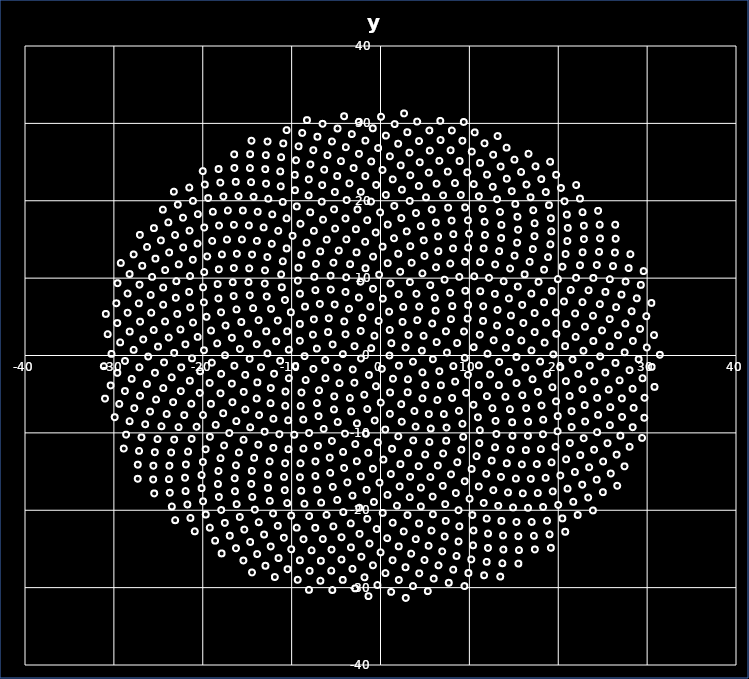
| Category | y |
|---|---|
| 1.0 | 0 |
| -1.0427970936428017 | 0.955 |
| 0.1514258902703649 | -1.725 |
| 1.2168775933951685 | 1.587 |
| -2.201886249462149 | -0.389 |
| 2.0667701175467137 | -1.315 |
| -0.6868488439654367 | 2.555 |
| -1.3036414562824385 | -2.51 |
| 2.8179636666845864 | 1.029 |
| -2.9230375956493755 | 1.207 |
| 1.4057389455386489 | -3.004 |
| 1.0367487365334913 | 3.305 |
| -3.1195627951311913 | -1.808 |
| 3.6543864048728047 | -0.803 |
| -2.22746789859802 | 3.168 |
| -0.5140411526383476 | -3.967 |
| 3.152727426917154 | 2.657 |
| -4.239017781566231 | 0.175 |
| 3.089717279442825 | -3.075 |
| -0.20657671794645202 | 4.467 |
| -2.936096255307038 | -3.518 |
| 4.64852723793221 | 0.625 |
| -3.9366999155815305 | 2.739 |
| 1.0752376934697032 | -4.78 |
| 2.48590156366684 | 4.338 |
| -4.857798015295011 | -1.55 |
| 4.7170226280028915 | -2.179 |
| -2.042846787210307 | 4.881 |
| -1.8226174734269953 | -5.067 |
| 4.848380230100924 | 2.548 |
| -5.383862284478178 | 1.419 |
| 3.059444241048141 | -4.758 |
| 0.9729871422187473 | 5.662 |
| -4.610082518912712 | -3.57 |
| 5.895880809300576 | -0.488 |
| -4.074480240837586 | 4.404 |
| 0.029679313881297995 | -6.083 |
| 4.1417737703254085 | 4.566 |
| -6.21834813116179 | -0.576 |
| 5.03788828144644 | -3.824 |
| -1.1460609228401943 | 6.3 |
| -3.451672677211961 | -5.485 |
| 6.324235433015204 | 1.733 |
| -5.901514804705317 | 3.029 |
| 2.331891982730801 | -6.29 |
| 2.5572200687000044 | 6.282 |
| -6.195148787465504 | -2.936 |
| 6.620681976627493 | -2.041 |
| -3.5393643128245627 | 6.039 |
| -1.484578362719784 | -6.913 |
| 5.822022914882723 | 4.136 |
| -7.1557458339192985 | 0.892 |
| 4.718752856929229 | -5.544 |
| 0.2677913955382807 | 7.344 |
| -5.205523482141479 | -5.282 |
| 7.473551358802312 | 0.382 |
| -5.820175460384126 | 4.809 |
| 1.0523599916907702 | -7.543 |
| 4.356126693917473 | 6.326 |
| -7.548708171978155 | -1.737 |
| 6.795407549658492 | -3.85 |
| -2.4297647347738476 | 7.49 |
| -3.293861630890022 | -7.222 |
| 7.364626127054 | 3.124 |
| -7.5996776580306955 | 2.692 |
| 3.814601393719907 | -7.173 |
| 2.0477156584077725 | 7.925 |
| -6.914263388139157 | -4.494 |
| 8.193373972120753 | -1.367 |
| -5.155114941727751 | 6.59 |
| -0.6547168776294818 | -8.401 |
| 6.200552287266446 | 5.793 |
| -8.54359692988896 | -0.083 |
| 6.39948894780885 | -5.749 |
| -0.8412798835335981 | 8.619 |
| -5.236481006769523 | -6.97 |
| 8.625499060132771 | 1.613 |
| -7.497748018424347 | 4.667 |
| 2.3910657700193485 | -8.561 |
| 4.0448220188972694 | 7.977 |
| -8.423360939036675 | -3.17 |
| 8.40362386503289 | -3.373 |
| -3.941761722648997 | 8.214 |
| -2.6575110926599104 | -8.771 |
| 7.931361323333284 | 4.7 |
| -9.076319074692739 | 1.903 |
| 5.438657778798727 | -7.578 |
| 1.1146932706645942 | 9.314 |
| -7.154010023229385 | -6.15 |
| 9.482105598167498 | -0.299 |
| -6.827146071129699 | 6.663 |
| 0.5365358084039645 | -9.577 |
| 6.106223624352265 | 7.464 |
| -9.59570006387784 | -1.387 |
| 8.054681740007293 | -5.488 |
| -2.24365386614781 | 9.538 |
| -4.813036414151504 | -8.593 |
| 9.401365126140643 | 3.101 |
| -9.072704226184475 | 4.085 |
| 3.9504521611844208 | -9.187 |
| 3.308951430444219 | 9.49 |
| -8.893694940298154 | -4.786 |
| 9.838451976726452 | -2.491 |
| -5.5989347758745085 | 8.524 |
| -1.6369490219107636 | -10.115 |
| 8.078053240485318 | 6.383 |
| -10.316606466458834 | 0.753 |
| 7.131313750881705 | -7.559 |
| -0.15281771884104275 | 10.439 |
| -6.970644039958124 | -7.836 |
| 10.480706522932923 | 1.075 |
| -8.492032765497799 | 6.315 |
| 2.0046002197953747 | -10.439 |
| 5.598207299772104 | 9.092 |
| -10.314281085926556 | -2.935 |
| 9.629750279197825 | -4.824 |
| -3.85885416894729 | 10.105 |
| -3.9973446110499413 | -10.101 |
| 9.81165750540846 | 4.768 |
| -10.499213597845515 | 3.125 |
| 5.654203325426085 | -9.436 |
| 2.2134925857403336 | 10.821 |
| -8.978412995663625 | -6.511 |
| 11.062958203458424 | -1.269 |
| -7.329502716213936 | 8.443 |
| -0.2995738261482835 | -11.221 |
| 7.831448576231053 | 8.104 |
| -11.292771809740017 | -0.688 |
| 8.82593237153248 | -7.149 |
| -1.6856333671399464 | 11.276 |
| -6.398677358932378 | -9.49 |
| 11.17086982231301 | 2.685 |
| -10.089050869219788 | 5.587 |
| 3.6793553709753057 | -10.976 |
| 4.718331971574417 | 10.618 |
| -10.6907379679323 | -4.659 |
| 11.070738435044447 | -3.8 |
| -5.6168541193205925 | 10.318 |
| -2.8379088137951447 | -11.443 |
| 9.857608522818861 | 6.544 |
| -11.730962185986698 | 1.84 |
| 7.433562416373874 | -9.314 |
| 0.81277928778123 | 11.931 |
| -8.688548474076466 | -8.277 |
| 12.039301232496229 | 0.235 |
| -9.067253265932298 | 7.987 |
| 1.2954902829092911 | -12.055 |
| 7.212150703992325 | 9.797 |
| -11.976176623015526 | -2.36 |
| 10.460170760927817 | -6.371 |
| -3.4210580324872777 | 11.802 |
| -5.467832477815905 | -11.05 |
| 11.533740296929068 | 4.469 |
| -11.561050434784706 | 4.51 |
| 5.495904539403401 | -11.171 |
| 3.504758706871615 | 11.988 |
| -10.716388022946688 | -6.493 |
| 12.32695974061193 | -2.459 |
| -7.452041979738917 | 10.172 |
| -1.3804202125928589 | -12.574 |
| 9.540873395018599 | 8.365 |
| -12.724894425843498 | 0.278 |
| 9.223762426207262 | -8.827 |
| -0.8410908935483941 | 12.779 |
| -8.036012948426716 | -10.021 |
| 12.733073861797 | 1.967 |
| -10.749851031410303 | 7.172 |
| 3.091055976039551 | -12.588 |
| 6.241985923194259 | 11.403 |
| -12.341887649177131 | -4.204 |
| 11.975690031308076 | -5.252 |
| -5.298293055390513 | 11.997 |
| -4.209245699952344 | -12.461 |
| 11.554456764707028 | 6.364 |
| -12.85518215626661 | 3.122 |
| 7.391439618777495 | -11.017 |
| 1.9970730195609516 | 13.153 |
| -10.386784795867298 | -8.373 |
| 13.352427078896897 | -0.844 |
| -9.301281419735853 | 9.669 |
| 0.3281866631991413 | -13.45 |
| 8.86748803842526 | 10.167 |
| -13.443091817320633 | -1.511 |
| 10.963051142124453 | -7.988 |
| -2.6951483610571403 | 13.332 |
| -7.037106978853936 | -11.682 |
| 13.115425331629215 | 3.871 |
| -12.318620800296184 | 6.021 |
| 5.029612591372445 | -12.795 |
| 4.947015504105854 | 12.866 |
| -12.370878613912275 | -6.161 |
| 13.318514248501673 | -3.823 |
| -7.256920195988216 | 11.846 |
| -2.6579576213687663 | -13.672 |
| 11.22430403241927 | 8.308 |
| -13.923671120869864 | 1.46 |
| 9.304361694388612 | -10.509 |
| 0.23825408596760478 | 14.069 |
| -9.70372115358941 | -10.239 |
| 14.106900780991756 | 0.998 |
| -11.10356315289638 | 8.815 |
| 2.238267295087915 | -14.035 |
| 7.849650300993459 | 11.89 |
| -13.853974212630401 | -3.474 |
| 12.592770308257572 | -6.813 |
| -4.694554177575003 | 13.563 |
| -5.714029264364662 | -13.204 |
| 13.164312945627831 | 5.891 |
| -13.71895499612133 | 4.56 |
| 7.052753732548915 | -12.659 |
| 3.3587423836123786 | 14.132 |
| -12.051246737248842 | -8.171 |
| 14.439672753986759 | -2.12 |
| -9.236701421853198 | 11.344 |
| -0.8538042479745327 | -14.638 |
| 10.541825421852963 | 10.241 |
| -14.724607662090515 | -0.431 |
| 11.174394588203622 | -9.651 |
| -1.724747963085524 | 14.698 |
| -8.676184665513935 | -12.03 |
| 14.556749844128758 | 3.017 |
| -12.800370425018265 | 7.626 |
| 4.297189308986362 | -14.302 |
| 6.506479857119222 | 13.478 |
| -13.933162289927612 | -5.556 |
| 14.057909974709128 | -5.327 |
| -6.782596708990005 | 13.453 |
| -4.095416564141486 | -14.534 |
| 12.865306437839108 | 7.968 |
| -14.90099445636362 | 2.821 |
| 9.101415044634841 | -12.172 |
| 1.5144194154709818 | 15.156 |
| -11.378909866474586 | -10.174 |
| 15.29594731949717 | -0.184 |
| -11.178017973997123 | 10.491 |
| 1.1585064978907877 | -15.319 |
| 9.513374053615959 | 12.104 |
| -15.22270475442516 | -2.504 |
| 12.943180838835888 | -8.454 |
| -3.8411569995307002 | 15.008 |
| -7.320734998532481 | -13.69 |
| 14.675668682001298 | 5.16 |
| -14.336384860309096 | 6.121 |
| 6.44967963717112 | -14.227 |
| 4.864204094464983 | 14.877 |
| -13.664109150370217 | -7.7 |
| 15.307876265431732 | -3.559 |
| -8.90121421427017 | 12.991 |
| -2.2163305066573815 | -15.623 |
| 12.212097182993336 | 10.043 |
| -15.820410947664326 | 0.845 |
| 11.116539468640187 | -11.332 |
| -0.5431609975437187 | 15.897 |
| -10.357964006866741 | -12.112 |
| 15.85062454139551 | 1.938 |
| -13.022641110691772 | 9.296 |
| 3.329791727183006 | -15.682 |
| 8.153297770044812 | 13.839 |
| -15.389979105612404 | -4.706 |
| 14.55511793892687 | -6.939 |
| -6.056936095018434 | 14.977 |
| -5.66150384696126 | -15.164 |
| 14.445250622460836 | 7.371 |
| -15.660346951511519 | 4.331 |
| 8.63853299897801 | -13.798 |
| 2.9559691441457248 | 16.039 |
| -13.03853581975934 | -9.849 |
| 16.297335161603055 | -1.548 |
| -10.991816256335783 | 12.173 |
| -0.11788399042460239 | -16.431 |
| 11.206771975581029 | 12.059 |
| -16.439195008018405 | -1.324 |
| 13.039977174349056 | -10.147 |
| -2.766213210006769 | 16.32 |
| -9.000778879410824 | -13.928 |
| 16.07419156049911 | 4.198 |
| -14.71467349638158 | 7.777 |
| 5.607093753997097 | -15.702 |
| 6.483847513475072 | 15.393 |
| -15.2063228081222 | -6.983 |
| 15.958302878340803 | -5.132 |
| -8.31561670195076 | 14.589 |
| -3.7299147848234764 | -16.404 |
| 13.855408788092536 | 9.593 |
| -16.72596562793675 | 2.29 |
| 10.805540298240846 | -13.009 |
| 0.8213773041149172 | 16.921 |
| -12.056680710078918 | -11.943 |
| 16.987050494278172 | 0.663 |
| -12.996277765824464 | 11.004 |
| 2.153390677390724 | -16.922 |
| 9.859877074446171 | 13.956 |
| -16.726388561755357 | -3.637 |
| 14.815509257285854 | -8.631 |
| -5.102739898336628 | 16.4 |
| -7.32786956863964 | -15.566 |
| 15.944933441166112 | 6.539 |
| -16.201565334941503 | 5.959 |
| 7.93458614461198 | -15.364 |
| 4.5348567495029855 | 16.716 |
| -14.659940560764174 | -9.278 |
| 17.10550367980478 | -3.066 |
| -10.55929929636039 | 13.838 |
| -1.5641776886222598 | -17.365 |
| 12.904633987864646 | 11.767 |
| -17.492809617535233 | 0.04 |
| 12.89255039471053 | -11.865 |
| -1.4941895892909123 | 17.486 |
| -10.727365368850057 | -13.926 |
| 17.34466223973096 | 3.027 |
| -14.858026096183028 | 9.499 |
| 4.546369326612573 | -17.068 |
| 8.190285751749686 | 15.682 |
| -16.658721056288314 | -6.04 |
| 16.389923107986647 | -6.81 |
| -7.497484939215911 | 16.118 |
| -5.367566735632506 | -16.976 |
| 15.449402838348117 | 8.906 |
| -17.435141234387686 | 3.875 |
| 10.254621797138068 | -14.658 |
| 2.343222070930613 | 17.763 |
| -13.747634147638433 | -11.533 |
| 17.955102347475673 | -0.784 |
| -12.729763022459315 | 12.726 |
| 0.7914059619391862 | -18.01 |
| 11.600081503326097 | 13.836 |
| -17.9271336733174 | -2.37 |
| 14.84260531962871 | -10.378 |
| -3.9404197754803967 | 17.705 |
| -9.067877694424709 | -15.741 |
| 17.345366926896872 | 5.49 |
| -16.52316467446578 | 7.68 |
| 7.006314673380863 | -16.85 |
| 6.224878879181062 | 17.183 |
| -16.22111963799109 | -8.478 |
| 17.714087465193007 | -4.713 |
| -9.893010986118647 | 15.464 |
| -3.1555023066133256 | -18.112 |
| 14.582741030361053 | 11.24 |
| -18.372590967665037 | 1.565 |
| 12.508875515266 | -13.584 |
| -0.04779174141991187 | 18.493 |
| -12.474921551161257 | -13.689 |
| 18.47196816456592 | 1.669 |
| -14.76963702834024 | 11.263 |
| 3.287298305993513 | -18.308 |
| 9.957482072203504 | 15.743 |
| -18.00260486106448 | -4.889 |
| 16.60110292429176 | -8.568 |
| -6.463061313438255 | 17.556 |
| -7.103675364950847 | -17.336 |
| 16.972471971834114 | 7.996 |
| -17.94158952754723 | 5.577 |
| 9.475970241921393 | -16.254 |
| 3.9980481586810974 | 18.412 |
| -15.407072021813871 | -10.891 |
| 18.74398662362531 | -2.38 |
| -12.230863622651016 | 14.436 |
| -0.7339264212246063 | -18.933 |
| 13.348835895319667 | 13.484 |
| -18.977387588591835 | -0.927 |
| 14.639541939802665 | -12.153 |
| -2.589401011733699 | 18.876 |
| -10.855983144884899 | -15.689 |
| 18.628229471449515 | 4.241 |
| -16.62359439130852 | 9.469 |
| 5.869715100477349 | -18.236 |
| 8.000876188794189 | 17.435 |
| -17.700902271722644 | -7.462 |
| 18.116948902245344 | -6.463 |
| -9.00502256523035 | 17.027 |
| -4.867914944805683 | -18.663 |
| 16.217802960324235 | 10.487 |
| -19.06806261432071 | 3.226 |
| 11.896737383898543 | -15.28 |
| 1.5510333477124014 | 19.329 |
| -14.218827017707847 | -13.222 |
| 19.441680586938325 | 0.145 |
| -14.452788320898156 | 13.043 |
| 1.8491277014868328 | -19.406 |
| 11.760307873723223 | 15.579 |
| -19.220103329066642 | -3.548 |
| 16.590554365918702 | -10.38 |
| -5.228285535708314 | 18.886 |
| -8.913432076195724 | -17.48 |
| 18.40391865052876 | 6.877 |
| -18.239534444264773 | 7.37 |
| 8.481725371694601 | -17.778 |
| 5.7621747387420115 | 18.863 |
| -17.012169724670375 | -10.029 |
| 19.34366522943572 | -4.102 |
| -11.507555303534465 | 16.111 |
| -2.4008152894415122 | -19.678 |
| 15.081948687764658 | 12.905 |
| -19.863211134052122 | 0.673 |
| 14.209905195567787 | -13.931 |
| -1.0688927370492847 | 19.896 |
| -12.667423023579804 | -15.412 |
| 19.776163277684127 | 2.811 |
| -16.50196886025767 | 11.3 |
| 4.5408125974752735 | -19.503 |
| 9.838319834089088 | 17.47 |
| -19.079099049938318 | -6.244 |
| 18.30879290492278 | -8.294 |
| -7.907681715680329 | 18.506 |
| -6.677910317065903 | -19.011 |
| 17.78747035549893 | 9.519 |
| -19.569722698377547 | 5.003 |
| 11.064435258503478 | -16.929 |
| 3.280552811222075 | 19.981 |
| -15.935306240328657 | -12.533 |
| 20.240425847703502 | -1.525 |
| -13.911492664680196 | 14.815 |
| 0.2511328842427642 | -20.345 |
| 13.574333810644436 | 15.19 |
| -20.294426097830264 | -2.034 |
| 16.357904123804875 | -12.224 |
| -3.8093750212462365 | 20.087 |
| -10.77253960122139 | -17.406 |
| 19.724095299786384 | 5.564 |
| -18.324257479358682 | 9.232 |
| 7.284548722446106 | -19.208 |
| 7.6122112540961275 | 19.106 |
| -18.541067592684325 | -8.957 |
| 19.745252656218103 | -5.927 |
| -10.568562839251687 | 17.729 |
| -4.1875159725890185 | -20.235 |
| 16.776057705898154 | 12.106 |
| -20.571860306503904 | 2.408 |
| 13.558229949064003 | -15.69 |
| 0.6016871888348588 | 20.752 |
| -14.47808376415756 | -14.913 |
| 20.772993650586034 | 1.218 |
| -16.158514218795638 | 13.149 |
| 3.036096257320039 | -20.634 |
| 11.71311359546382 | 17.286 |
| -20.336637098687923 | -4.84 |
| 18.28555478153726 | -10.18 |
| -6.6140438039813745 | 19.881 |
| -8.562171717046688 | -19.149 |
| 19.270391733140624 | 8.346 |
| -19.869368420613007 | 6.871 |
| 10.021197644535814 | -18.509 |
| 5.118961334786726 | 20.44 |
| -17.601415609605922 | -11.627 |
| 20.856144563443966 | -3.32 |
| -13.150881608159017 | 16.555 |
| -1.4870712909613508 | -21.114 |
| 15.3757555480822 | 14.58 |
| -21.210057591282485 | -0.365 |
| 15.904047032282968 | -14.073 |
| -2.223148567326424 | 21.144 |
| -12.657086051644594 | -17.111 |
| 20.914535916311888 | 4.072 |
| -18.192410543693573 | 11.137 |
| 5.897949090337883 | -20.524 |
| 9.524889620401188 | 19.138 |
| -19.972943730756374 | -7.686 |
| 19.941284295718052 | -7.832 |
| -9.423677920258577 | 19.266 |
| -6.072130434582072 | -20.594 |
| 18.40864929426374 | 11.096 |
| -21.092007992467963 | 4.258 |
| 12.690302273777442 | -17.406 |
| 2.4024896027239895 | 21.43 |
| -16.264472545070774 | -14.194 |
| 21.603903715643803 | -0.521 |
| -15.594849007353607 | 14.993 |
| 1.3727556103368534 | -21.613 |
| 13.601524112862984 | 16.882 |
| -21.45568881195591 | -3.264 |
| 18.044654262188402 | -12.099 |
| -5.1381144048606435 | 21.133 |
| -10.497466876310574 | -19.074 |
| 20.646298473363295 | 6.981 |
| -19.960320063495978 | 8.808 |
| 8.777423839058509 | -19.999 |
| 7.044249448056655 | 20.697 |
| -19.195087652062732 | -10.514 |
| 21.278283568310037 | -5.219 |
| -12.177440156957651 | 18.24 |
| -3.345377808592461 | -21.698 |
| 17.14140104695307 | 13.754 |
| -21.952915981680526 | 1.439 |
| 15.231368807751767 | -15.906 |
| -0.4871937887914052 | 22.04 |
| -14.543519489352208 | -16.598 |
| 21.95808216069666 | 2.417 |
| -17.8422229575029 | 13.064 |
| 4.336459036288925 | -21.707 |
| 11.477010535090924 | 18.955 |
| -21.288108182185947 | -6.23 |
| 19.92590478282118 | -9.796 |
| -8.083939649116735 | 20.704 |
| -8.032529828231308 | -20.748 |
| 19.958122171509682 | 9.883 |
| -21.413911653462453 | 6.2 |
| 11.61333952636508 | -19.056 |
| 4.313137248420406 | 21.918 |
| -18.003752927149716 | -13.261 |
| 22.255580237121936 | -2.385 |
| -14.8141600804903 | 16.809 |
| -0.43120743474101064 | -22.424 |
| 15.480190736993478 | 16.259 |
| -22.419795276490973 | -1.534 |
| 17.58516417667173 | -14.027 |
| -3.494972505235052 | 22.244 |
| -12.460634652372331 | -18.781 |
| 21.8961058874179 | 5.437 |
| -19.83757998762466 | 10.792 |
| 7.344814870533215 | -21.379 |
| 9.034169745124972 | 20.746 |
| -20.695210223072806 | -9.204 |
| 21.49794334711155 | -7.2 |
| -10.9991423126897 | 19.85 |
| -5.303135916460622 | -22.088 |
| 18.848788694203638 | 12.717 |
| -22.51048767261156 | 3.358 |
| 14.34388344390577 | -17.699 |
| 1.3800660834194614 | 22.762 |
| -16.40868603660241 | -15.867 |
| 22.839003920753363 | 0.616 |
| -17.273638337023797 | 14.987 |
| 2.6157144804855066 | -22.741 |
| 13.445462752311103 | 18.553 |
| -22.468108940431406 | -4.603 |
| 19.695002353645638 | -11.794 |
| -6.561724679089029 | 22.021 |
| -10.04635619166448 | -20.69 |
| 21.40387852019227 | 8.478 |
| -21.52954343683435 | 8.215 |
| 10.336088960363924 | -20.62 |
| 6.312710170333554 | 22.207 |
| -19.67382084387584 | -12.122 |
| 22.716338014063982 | -4.355 |
| -13.821307801360003 | 18.573 |
| -2.356948941539739 | -23.053 |
| 17.326186377022783 | 15.421 |
| -23.21398368453376 | 0.333 |
| 16.907920488567278 | -15.941 |
| -1.7008139697882685 | 23.197 |
| -14.428630780032277 | -18.271 |
| 23.002022528281618 | 3.729 |
| -19.49794588774277 | 12.8 |
| 5.736429589938924 | -22.629 |
| 11.066267643750571 | 20.58 |
| -22.08172670228004 | -7.707 |
| 21.50799298375982 | -9.242 |
| -9.625518623509222 | 21.362 |
| -7.339167038246041 | -22.274 |
| 20.476217441087172 | 11.477 |
| -22.871942462764473 | 5.373 |
| 13.247311060062474 | -19.43 |
| 3.3593734514838975 | 23.296 |
| -18.22990906189725 | -14.922 |
| 23.543113232536935 | -1.312 |
| -16.48840155588288 | 16.886 |
| 0.752467885516039 | -23.61 |
| 15.40729045599528 | 17.934 |
| -23.495843160740627 | -2.819 |
| 19.246303681585594 | -13.805 |
| -4.870774531302474 | 23.201 |
| -12.0910771835217 | -20.416 |
| 22.726430994594082 | 6.893 |
| -21.432691564266854 | 10.278 |
| 8.868868783956465 | -22.076 |
| 8.379787033290505 | 22.289 |
| -21.253405874292884 | -10.784 |
| 22.976226388339267 | -6.41 |
| -12.622880318726429 | 20.265 |
| -4.384810144127236 | -23.49 |
| 19.11711147345474 | 14.371 |
| -23.824877397553138 | 2.318 |
| 16.015589108108273 | -17.819 |
| 0.2270609324871971 | 23.978 |
| -16.37861295934586 | -17.543 |
| 23.947662103698985 | 1.873 |
| -18.94008926263834 | 14.808 |
| 3.966687382056854 | -23.733 |
| 13.11795600993353 | 20.197 |
| -23.33574790627589 | -6.037 |
| 21.3031591856842 | -11.321 |
| -8.06767435476499 | 22.758 |
| -9.431827398902145 | -22.25 |
| 22.002876733382777 | 10.044 |
| -23.028231777277533 | 7.463 |
| 11.949111575751637 | -21.076 |
| 5.4306855296161265 | 23.633 |
| -19.985095036877155 | -13.769 |
| 24.057870114332534 | -3.349 |
| -15.490107696145971 | 18.737 |
| -1.2354461688904463 | -24.3 |
| 17.339792879001806 | 17.098 |
| -24.355668735783706 | -0.895 |
| 18.5794375686776 | -15.805 |
| -3.0261770341519556 | 24.225 |
| -14.144077273041866 | -19.923 |
| 23.907517933056955 | 5.141 |
| -21.119037889344863 | 12.369 |
| 7.223566321650701 | -23.406 |
| 10.492525721933985 | 22.156 |
| -22.72218776927105 | -9.258 |
| 23.027119438034468 | -8.529 |
| -11.22720900055092 | 21.862 |
| -6.494385387100751 | -23.724 |
| 20.831209337168502 | 13.117 |
| -24.24079718250238 | 4.403 |
| 14.912698789018846 | -19.637 |
| 2.27030090260002 | 24.573 |
| -18.288052380214804 | -16.6 |
| 24.718153807640302 | -0.113 |
| -18.164605566872172 | 16.794 |
| 2.0513310310032624 | -24.674 |
| 15.166620177749746 | 19.595 |
| -24.43966923534683 | -4.207 |
| 20.880093051209005 | -13.417 |
| -6.338269965978325 | 24.017 |
| -11.559103859249273 | -22.009 |
| 23.408967898865264 | 8.427 |
| -22.972170962575778 | 9.606 |
| 10.45848380336777 | -22.619 |
| 7.573258401458304 | 23.762 |
| -21.65285634693622 | -12.416 |
| 24.372478848764796 | -5.476 |
| -14.284220335903939 | 20.517 |
| -3.329180845931987 | -24.798 |
| 19.220645541723492 | 16.049 |
| -25.033512585490815 | 1.15 |
| 17.69597253466465 | -17.772 |
| -1.0443128250972569 | 25.078 |
| -16.182774310530977 | -19.212 |
| 24.93022126597538 | 3.238 |
| -20.586214388092564 | 14.464 |
| 5.413602706442546 | -24.591 |
| 12.628772131467782 | 21.806 |
| -24.060921223725014 | -7.555 |
| 22.862790443466725 | -10.691 |
| -9.644352733544567 | 23.345 |
| -8.664620102222656 | -23.747 |
| 22.447494728925008 | 11.667 |
| -24.45185219925289 | 6.566 |
| 13.605645976001018 | -21.375 |
| 4.409587911563583 | 24.971 |
| -20.134862824307366 | -15.446 |
| 25.300247862471096 | -2.213 |
| -17.174040016665934 | 18.736 |
| 0.0073586919227425504 | -25.436 |
| 17.189744148587494 | 18.775 |
| -25.37728832473939 | -2.235 |
| 20.237416675798976 | -15.506 |
| -4.451471591126214 | 25.123 |
| -13.698733743390093 | -21.549 |
| 24.675831034384295 | 6.641 |
| -22.698505945227136 | 11.78 |
| 8.786336231778515 | -24.037 |
| 9.765757065919251 | 23.678 |
| -23.21264418147968 | -10.871 |
| 24.47797335360918 | -7.67 |
| -12.878063915251724 | 22.207 |
| -5.508974071201064 | -25.093 |
| 21.0280356364231 | 14.793 |
| -25.516972822888707 | 3.299 |
| 16.59943146969767 | -19.684 |
| 1.0572256673272127 | 25.747 |
| -18.184753715924757 | -18.284 |
| 25.77908301939204 | 1.2 |
| -19.83384018434395 | 16.541 |
| 3.45387046764579 | -25.614 |
| 14.766189395641502 | 21.236 |
| -25.25156377549582 | -5.688 |
| 22.478970728396725 | -12.872 |
| -7.886056258742031 | 24.694 |
| -10.873931347480195 | -23.553 |
| 23.945889798610626 | 10.03 |
| -24.450019452991135 | 8.786 |
| 12.10267548629591 | -23.011 |
| 6.624745474058779 | 25.162 |
| -21.897540966363465 | -14.089 |
| 25.682413745998865 | -4.406 |
| -15.972891606331398 | 20.612 |
| -2.1470688058609824 | -26.008 |
| 19.16505135465993 | 17.74 |
| -26.133919614777824 | -0.135 |
| 19.375750834551145 | -17.566 |
| -2.4228768556928193 | 26.06 |
| -15.82834205601992 | -20.868 |
| 25.78607294950307 | 4.699 |
| -22.203964224772125 | 13.964 |
| 6.94523381970762 | -25.313 |
| 11.986385110370918 | 23.374 |
| -24.64488641940361 | -9.145 |
| 24.367290434927696 | -9.911 |
| -11.280793406308462 | 23.785 |
| -7.754266796857157 | -25.177 |
| 22.74080605366543 | 13.336 |
| -25.795412537169668 | 5.531 |
| 15.29528544616129 | -21.519 |
| 3.259737468668911 | 26.218 |
| -20.127914583270154 | -17.143 |
| 26.440217253651547 | -0.957 |
| -18.863540079869193 | 18.579 |
| 1.360648543922592 | -26.46 |
| 16.882401862110736 | 20.445 |
| -26.277402938796474 | -3.674 |
| 21.87339276229463 | -15.052 |
| -5.965686202783042 | 25.892 |
| -13.10034542795786 | -23.138 |
| 25.307362943926957 | 8.218 |
| -24.229210588565838 | 11.043 |
| 10.413839745731668 | -24.527 |
| 8.894865799629692 | 25.137 |
| -23.555313075019743 | -12.536 |
| 25.85492907549499 | -6.673 |
| -14.567597083039868 | 22.401 |
| -4.392740764241115 | -26.376 |
| 21.07065501617861 | 16.493 |
| -26.696503034276976 | 2.073 |
| 18.29772451684098 | -19.575 |
| -0.26941993091516175 | 26.813 |
| -17.92559112954334 | -19.967 |
| 26.72369272815004 | 2.616 |
| -21.487290038357195 | 16.134 |
| 4.949323946951644 | -26.429 |
| 14.213029231281858 | 22.847 |
| -25.931126594961476 | -7.251 |
| 24.035329884547874 | -12.178 |
| -9.503343619959125 | 25.233 |
| -10.04383806403829 | -25.042 |
| 24.338603822282813 | 11.689 |
| -25.860043367950354 | 7.827 |
| 13.790928176043241 | -23.255 |
| 5.543534549421768 | 26.481 |
| -21.99062332121185 | -15.793 |
| 26.901414931293136 | -3.212 |
| -17.678945227476703 | 20.554 |
| -0.848501871502553 | -27.116 |
| 18.955149442310958 | 19.435 |
| -27.123179510917478 | -1.527 |
| 21.045817340463326 | -17.207 |
| -3.898147554704267 | 26.922 |
| -15.321648380249178 | -22.5 |
| 26.51406710660278 | 6.245 |
| -23.785325074348457 | 13.314 |
| 8.550938615063794 | -25.901 |
| 11.198451892726181 | 24.892 |
| -25.088284351985504 | -10.797 |
| 25.80995750118669 | -8.991 |
| -12.966496171394018 | 24.08 |
| -6.709526007976085 | -26.533 |
| 22.88521419349394 | 15.042 |
| -27.05370454757873 | 4.37 |
| 17.007966856871406 | -21.511 |
| 1.9907411557129189 | 27.369 |
| -19.968338803526105 | -18.848 |
| 27.474202163885547 | 0.41 |
| -20.549263513578424 | 18.268 |
| 2.8142439632758403 | -27.369 |
| 16.423414837129002 | 22.097 |
| -27.054160822423803 | -5.203 |
| 23.479000554621123 | -14.448 |
| -7.558359958269055 | 26.531 |
| -12.35595334957185 | -24.685 |
| 25.80202958743052 | 9.862 |
| -25.703997382924022 | 10.164 |
| 12.0956322623022 | -24.874 |
| 7.888078404541229 | 26.529 |
| -23.751871325835847 | -14.242 |
| 27.152239685959994 | -5.546 |
| -16.285676429333094 | 22.445 |
| -3.1548579404641477 | -27.569 |
| 20.96244882634819 | 18.209 |
| -27.77520457694075 | 0.733 |
| 19.998044673782488 | -19.315 |
| -1.6997827876249592 | 27.769 |
| -17.515545922500845 | -21.638 |
| 27.549474687195552 | 4.126 |
| -23.11628899267433 | 15.577 |
| 6.527441443248603 | -27.118 |
| 13.513571422136147 | 24.421 |
| -26.477587855771052 | -8.885 |
| 25.54161426581505 | -11.341 |
| -11.179779093710188 | 25.632 |
| -9.076515996818676 | -26.469 |
| 24.58809235715518 | 13.395 |
| -27.196006730637823 | 6.736 |
| 15.513081906558337 | -23.353 |
| 4.338352482600124 | 27.716 |
| -21.934801946284082 | -17.518 |
| 28.02473882486997 | -1.901 |
| -19.39270366837038 | 20.345 |
| 0.557012347981385 | -28.119 |
| 18.595269635115734 | 21.124 |
| -27.99817011741481 | -3.017 |
| 22.69725170979919 | -16.698 |
| -5.4601121202234575 | 27.662 |
| -14.668523288451846 | -24.101 |
| 27.112785343770547 | 7.867 |
| -25.322386047391493 | 12.521 |
| 10.220488218720677 | -26.354 |
| 10.27212908947438 | 26.353 |
| -25.391433781526523 | -12.501 |
| 27.18411282912607 | -7.939 |
| -14.691310491470665 | 24.231 |
| -5.538669963855215 | -27.809 |
| 22.882758637050976 | 16.774 |
| -28.221468169637564 | 3.09 |
| 18.733909282835885 | -21.355 |
| 0.6117445058232371 | 28.419 |
| -19.65983001795368 | -20.555 |
| 28.398506736922926 | 1.877 |
| -22.222078819878583 | 17.81 |
| 4.3583927604921975 | -28.16 |
| 15.81801967130917 | 23.723 |
| -27.705530457013843 | -6.812 |
| 25.04601834052217 | -13.7 |
| -9.219417313690938 | 27.037 |
| -11.472179214102509 | -26.18 |
| 26.15951580163331 | 11.562 |
| -27.115787866407477 | 9.151 |
| 13.821606681776919 | -25.079 |
| 6.753205338509922 | 27.846 |
| -23.803722613273674 | -15.981 |
| 28.364169882428293 | -4.298 |
| -18.02245519573349 | 22.343 |
| -1.804094761134208 | -28.666 |
| 20.706492553757755 | 19.931 |
| -28.748845964926883 | -0.71 |
| 21.69108912119922 | -18.908 |
| -3.2243921051648536 | 28.611 |
| -16.959270263701896 | -23.289 |
| 28.253818068258003 | 5.72 |
| -24.71234530947364 | 14.876 |
| 8.178327158932412 | -27.679 |
| 12.673904419990954 | 25.949 |
| -26.89002711122616 | -10.58 |
| 26.990386223812116 | -10.369 |
| -12.905330077414064 | 25.893 |
| -7.979308328297181 | -27.827 |
| 24.695146003993013 | 15.138 |
| -28.45173787563518 | 5.523 |
| 17.259258682744303 | -23.305 |
| 3.017579788625137 | 28.86 |
| -21.732549574055522 | -19.253 |
| 29.0476544446028 | -0.483 |
| -21.104729740078508 | 19.99 |
| 2.060302907692294 | -29.013 |
| 18.089489209904926 | 22.798 |
| -28.755733641567407 | -4.594 |
| 24.321330267464397 | -16.046 |
| -7.099078392330988 | 28.277 |
| -13.874524661048472 | -25.661 |
| 27.58072959210702 | 9.555 |
| -26.807388315883138 | 11.592 |
| 11.943952946529242 | -26.671 |
| 9.214288551065582 | 27.751 |
| -25.554534481833155 | -14.247 |
| 28.483185135782325 | -6.761 |
| -16.445359071905067 | 24.239 |
| -4.24968005598446 | -28.999 |
| 22.735325666200136 | 18.523 |
| -29.2935073013088 | 1.7 |
| 20.46357552539052 | -21.053 |
| -0.8683977798095156 | 29.364 |
| -19.205900627015662 | -22.252 |
| 29.209457219633336 | 3.436 |
| -23.873066032189232 | 17.207 |
| 5.983628043197195 | -28.83 |
| 15.071247264416813 | 25.315 |
| -28.229462911817166 | -8.491 |
| 26.566401899299176 | -12.815 |
| -10.939057554824743 | 27.411 |
| -10.455420770109098 | -27.617 |
| 26.379452333341412 | 13.309 |
| -28.457645949164824 | 8.01 |
| 15.581915952305755 | -25.144 |
| 5.49781999754985 | 29.082 |
| -23.712183063670295 | -17.741 |
| 29.485091220204243 | -2.938 |
| -19.768328193837394 | 22.096 |
| -0.3489751491762952 | -29.663 |
| 20.30574415243991 | 21.649 |
| -29.613267262476377 | -2.248 |
| 23.367775036497534 | -18.356 |
| -4.8340258540063346 | 29.337 |
| -16.261272466819793 | -24.911 |
| 28.834149009001145 | 7.389 |
| -26.26716314856985 | 14.037 |
| 9.892333263668098 | -28.109 |
| 11.699950251021622 | 27.425 |
| -27.167527456538007 | -12.326 |
| 28.374377912694374 | -9.268 |
| -14.67020713902129 | 26.015 |
| -6.759373028337873 | -29.109 |
| 24.660527005376547 | 16.907 |
| -29.6212073338129 | 4.193 |
| 19.01981522613877 | -23.114 |
| 1.5893967500697086 | 29.908 |
| -21.38628050284036 | -20.991 |
| 29.96554432636689 | 1.033 |
| -22.805809192091047 | 19.491 |
| 3.6524103978810993 | -29.794 |
| 17.4417990048606 | 24.45 |
| -29.392796454010703 | -6.25 |
| 25.909537493948356 | -15.254 |
| -8.805573402534812 | 28.766 |
| -12.945098213294617 | -27.174 |
| 27.91645627240611 | 11.299 |
| -28.232763723196452 | 10.531 |
| 13.71162639767592 | -26.851 |
| 8.031666690731644 | 29.077 |
| -25.57781105008007 | -16.024 |
| 29.700773910770277 | -5.465 |
| -18.21898851512515 | 24.105 |
| -2.8503815782585913 | -30.098 |
| 22.44479703099984 | 20.279 |
| -30.26477457256568 | 0.208 |
| 22.187649504564018 | -20.608 |
| -2.4410050000298793 | 30.2 |
| -18.610029745682283 | -23.93 |
| 29.90350467294757 | 5.077 |
| -25.493520217652005 | 16.465 |
| 7.680671921833649 | -29.377 |
| 14.188067363853607 | 26.864 |
| -28.624008537513372 | -10.231 |
| 28.03231273903957 | -11.798 |
| -12.707680932328982 | 27.65 |
| -9.311987922292563 | -28.988 |
| 26.461542332617814 | 15.093 |
| -29.72282883766306 | 6.749 |
| 17.36692276708354 | -25.068 |
| 4.129382714917825 | 30.232 |
| -23.47861326674537 | -19.513 |
| 30.509553096024046 | -1.472 |
| -21.51390543900569 | 21.706 |
| 1.2021134713387585 | -30.554 |
| 19.76317734484948 | 23.354 |
| -30.364468023908767 | -3.873 |
| 25.019236805183844 | -17.665 |
| -6.5196198325942945 | 29.942 |
| -15.426047499875807 | -26.496 |
| 29.28803204549431 | 9.122 |
| -27.77266230866015 | 13.064 |
| 11.659988640952957 | -28.409 |
| 10.597588432989243 | 28.839 |
| -27.30928674895361 | -14.114 |
| 29.686531886522705 | -8.044 |
| -16.4648136583501 | 25.998 |
| -5.423796754587245 | -30.308 |
| 24.485086428886035 | 18.694 |
| -30.698587064874836 | 2.756 |
| 20.78531403570382 | -22.781 |
| 0.061884336941670774 | 30.854 |
| -20.898469918114127 | -22.721 |
| 30.77397971481136 | 2.639 |
| -24.486943049036952 | 18.852 |
| 5.324501439613034 | -30.457 |
| 16.656221168193934 | 26.069 |
| -29.90645720556721 | -7.975 |
| 27.453578861242573 | -14.328 |
| -10.570275143241796 | 29.125 |
| -11.885690180100026 | -28.631 |
| 28.118674057480252 | 13.09 |
| -29.591166761187328 | 9.347 |
| 15.513975749709664 | -26.895 |
| 6.730968928568173 | 30.326 |
| -25.46161689511317 | -17.824 |
| 30.83069866211999 | -4.058 |
| -20.002738776330293 | 23.83 |
| -1.3485371485589968 | -31.1 |
| 22.01315671421665 | 22.032 |
| -31.130435552624284 | -1.377 |
| 23.897024902958698 | -20.023 |
| -4.0974903755311125 | 30.923 |
| -17.8757693689766 | -25.582 |
| 30.477301486872562 | 6.792 |
| -27.074958755258802 | 15.587 |
| 9.440370585794707 | -29.797 |
| 13.173490929136431 | 28.363 |
| -28.88740288449885 | -12.022 |
| 29.4361429162619 | -10.654 |
| -14.515840161393141 | 27.754 |
| -8.048198353870418 | -30.286 |
| 26.405653617440343 | 16.904 |
| -30.904827821451924 | 5.375 |
| 19.167168201010266 | -24.852 |
| 2.6553270389145194 | 31.288 |
| -23.10451377636407 | -21.288 |
| 31.432337514503313 | 0.09 |
| -23.249998085003387 | 21.176 |
| 2.8408454426589276 | -31.336 |
| 19.081877291138806 | 25.038 |
| -30.998673717668964 | -5.575 |
| 26.636828881367183 | -16.837 |
| -8.272206230271777 | 30.423 |
| -14.458169889055124 | -28.035 |
| 29.61324562196821 | 10.911 |
| -29.22099714318993 | 11.964 |
| 13.471952012489972 | -28.575 |
| 9.372743396276304 | 30.185 |
| -27.31469947047387 | -15.934 |